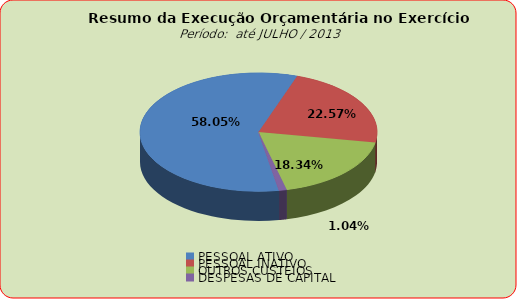
| Category | Series 0 |
|---|---|
| PESSOAL ATIVO | 55680291.12 |
| PESSOAL INATIVO | 21644803.84 |
| OUTROS CUSTEIOS | 17594393.45 |
| DESPESAS DE CAPITAL | 996945.7 |